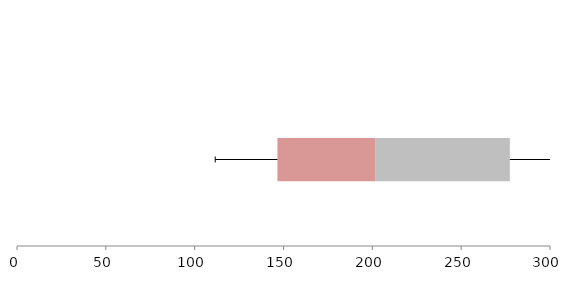
| Category | Series 1 | Series 2 | Series 3 |
|---|---|---|---|
| 0 | 146.599 | 55.26 | 75.541 |